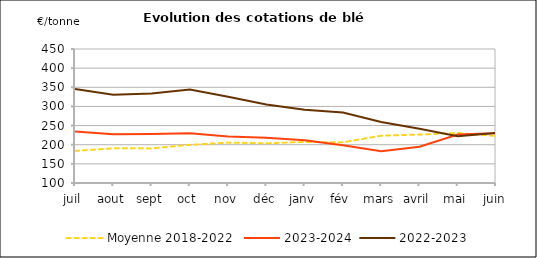
| Category | Moyenne 2018-2022 | 2023-2024 | 2022-2023 |
|---|---|---|---|
| juil | 183.822 | 234.72 | 345.624 |
| aout | 190.681 | 227.42 | 330.317 |
| sept | 190.363 | 227.71 | 333.703 |
| oct | 199.651 | 229.89 | 344.163 |
| nov | 205.489 | 221.76 | 325.29 |
| déc | 203.824 | 218.34 | 304.895 |
| janv | 207.213 | 211.66 | 291.341 |
| fév | 206.254 | 198.598 | 283.888 |
| mars | 223.603 | 183.013 | 259.357 |
| avril | 226.627 | 194.6 | 241.6 |
| mai | 230.522 | 226.39 | 221.853 |
| juin | 222.809 | 230.27 | 230.725 |